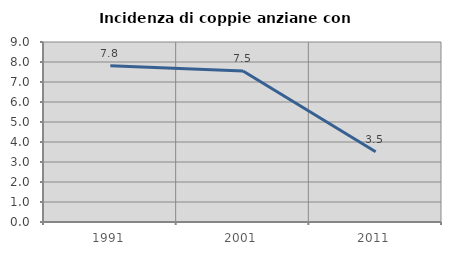
| Category | Incidenza di coppie anziane con figli |
|---|---|
| 1991.0 | 7.812 |
| 2001.0 | 7.547 |
| 2011.0 | 3.509 |